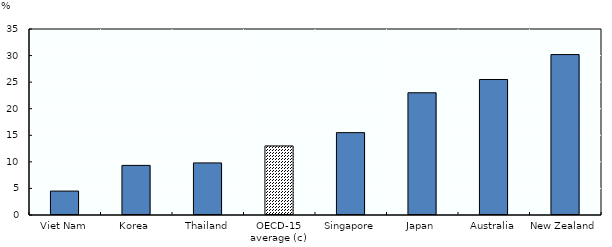
| Category | % |
|---|---|
| Viet Nam | 4.5 |
| Korea | 9.334 |
| Thailand | 9.8 |
| OECD-15 average (c) | 12.996 |
| Singapore | 15.5 |
| Japan | 23 |
| Australia | 25.5 |
| New Zealand | 30.189 |